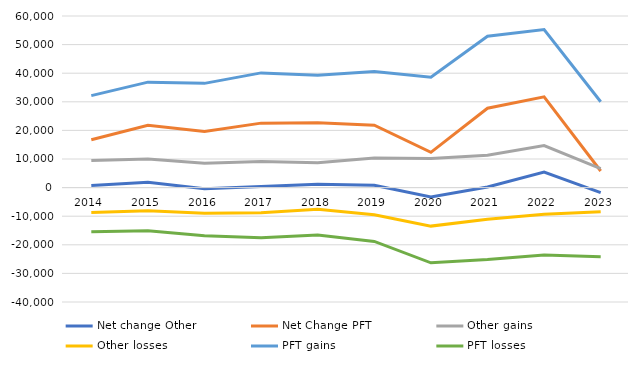
| Category | Net change Other  | Net Change PFT  | Other gains | Other losses | PFT gains | PFT losses |
|---|---|---|---|---|---|---|
| 2014 | 716 | 16731 | 9435 | -8719 | 32152 | -15421 |
| 2015 | 1903 | 21774 | 9988 | -8085 | 36868 | -15094 |
| 2016 | -403 | 19625 | 8534 | -8937 | 36451 | -16826 |
| 2017 | 355 | 22541 | 9124 | -8769 | 40111 | -17570 |
| 2018 | 1145 | 22716 | 8682 | -7537 | 39292 | -16576 |
| 2019 | 852 | 21815 | 10327 | -9475 | 40632 | -18817 |
| 2020 | -3315 | 12339 | 10151 | -13466 | 38627 | -26288 |
| 2021 | 201 | 27741 | 11288 | -11087 | 52908 | -25167 |
| 2022 | 5409 | 31732 | 14720 | -9311 | 55260 | -23528 |
| 2023 | -1773 | 5806 | 6641 | -8414 | 30004 | -24198 |